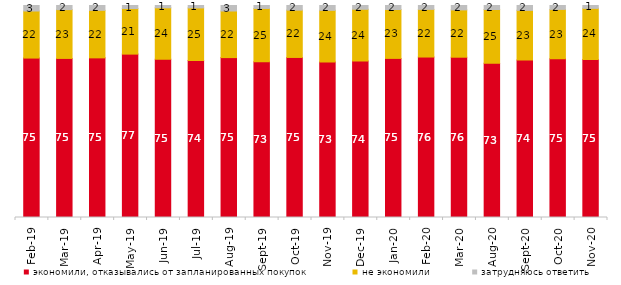
| Category | экономили, отказывались от запланированных покупок | не экономили | затрудняюсь ответить |
|---|---|---|---|
| 2019-02-01 | 75.2 | 22.2 | 2.6 |
| 2019-03-01 | 75.037 | 23.023 | 1.939 |
| 2019-04-01 | 75.297 | 22.426 | 2.277 |
| 2019-05-01 | 77.068 | 21.496 | 1.436 |
| 2019-06-01 | 74.663 | 24.239 | 1.097 |
| 2019-07-01 | 74.109 | 24.752 | 1.139 |
| 2019-08-01 | 75.425 | 21.978 | 2.597 |
| 2019-09-01 | 73.465 | 25.149 | 1.386 |
| 2019-10-01 | 75.495 | 22.327 | 2.178 |
| 2019-11-01 | 73.366 | 24.356 | 2.277 |
| 2019-12-01 | 73.861 | 24.356 | 1.782 |
| 2020-01-01 | 75.05 | 23.069 | 1.881 |
| 2020-02-01 | 75.693 | 22.475 | 1.832 |
| 2020-03-01 | 75.607 | 22.31 | 2.082 |
| 2020-08-01 | 72.79 | 25.323 | 1.887 |
| 2020-09-01 | 74.316 | 23.395 | 2.29 |
| 2020-10-01 | 74.838 | 23.318 | 1.844 |
| 2020-11-01 | 74.55 | 24.1 | 1.35 |